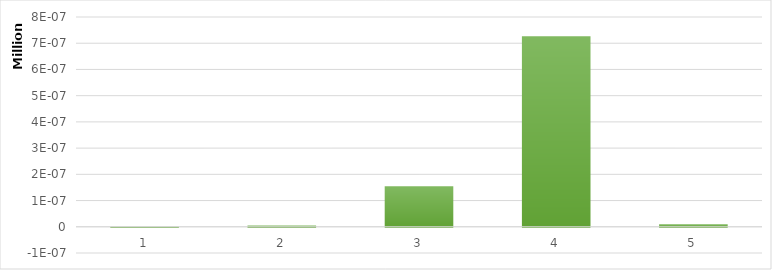
| Category | Maturity |
|---|---|
| 0 | 0 |
| 1 | 0.005 |
| 2 | 0.154 |
| 3 | 0.727 |
| 4 | 0.01 |